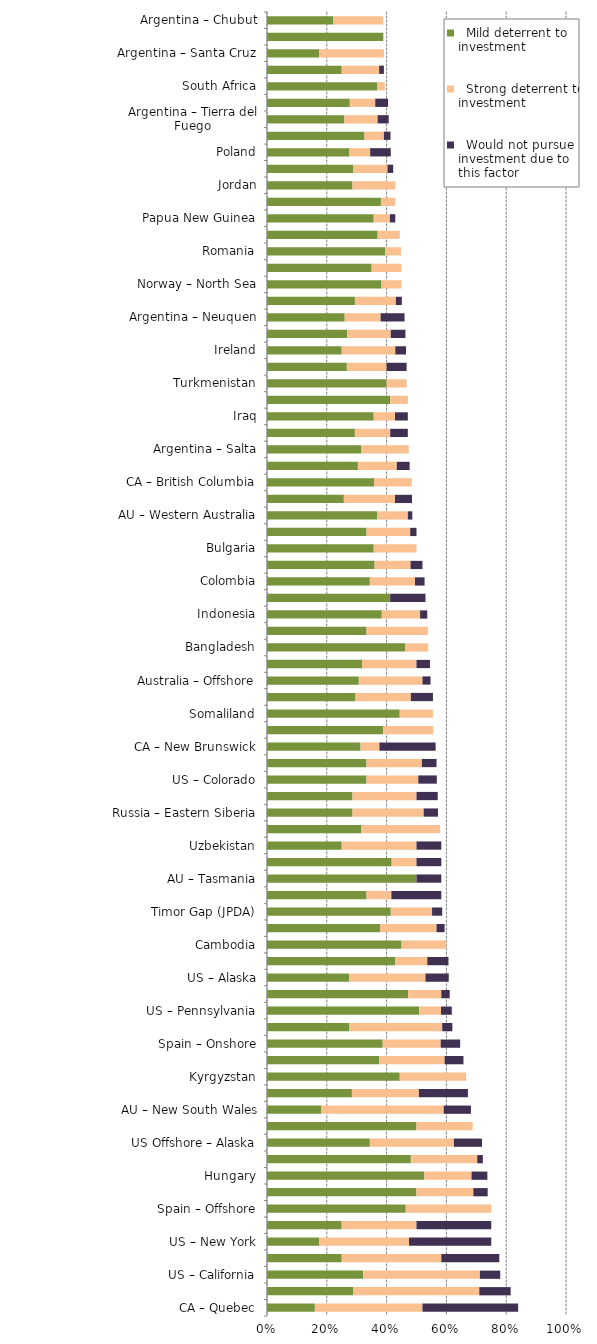
| Category |   Mild deterrent to investment |   Strong deterrent to investment |   Would not pursue investment due to this factor |
|---|---|---|---|
| CA – Quebec | 0.16 | 0.36 | 0.32 |
| Ecuador | 0.289 | 0.421 | 0.105 |
| US – California | 0.322 | 0.39 | 0.068 |
| France | 0.25 | 0.333 | 0.194 |
| US – New York | 0.175 | 0.3 | 0.275 |
| US Offshore – Pacific | 0.25 | 0.25 | 0.25 |
| Spain – Offshore | 0.464 | 0.286 | 0 |
| Brazil – Offshore presalt area profit sharing contracts | 0.5 | 0.19 | 0.048 |
| Hungary | 0.526 | 0.158 | 0.053 |
| Brazil – Offshore concession contracts | 0.481 | 0.222 | 0.019 |
| US Offshore – Alaska | 0.344 | 0.281 | 0.094 |
| Guatemala | 0.5 | 0.188 | 0 |
| AU – New South Wales | 0.182 | 0.409 | 0.091 |
| Venezuela | 0.284 | 0.224 | 0.164 |
| Kyrgyzstan | 0.444 | 0.222 | 0 |
| Peru | 0.375 | 0.219 | 0.063 |
| Spain – Onshore | 0.387 | 0.194 | 0.065 |
| Germany | 0.276 | 0.31 | 0.034 |
| US – Pennsylvania | 0.509 | 0.073 | 0.036 |
| Brazil – Onshore concession contracts | 0.472 | 0.111 | 0.028 |
| US – Alaska | 0.275 | 0.255 | 0.078 |
| Israel | 0.429 | 0.107 | 0.071 |
| Cambodia | 0.45 | 0.15 | 0 |
| AU – Queensland | 0.378 | 0.189 | 0.027 |
| Timor Gap (JPDA) | 0.414 | 0.138 | 0.034 |
| Iran | 0.333 | 0.083 | 0.167 |
| AU – Tasmania | 0.5 | 0 | 0.083 |
| Russia –  Offshore Arctic | 0.417 | 0.083 | 0.083 |
| Uzbekistan | 0.25 | 0.25 | 0.083 |
| Italy | 0.316 | 0.263 | 0 |
| Russia – Eastern Siberia | 0.286 | 0.238 | 0.048 |
| Bolivia | 0.286 | 0.214 | 0.071 |
| US – Colorado | 0.333 | 0.173 | 0.062 |
| US Offshore – Gulf of Mexico | 0.333 | 0.185 | 0.049 |
| CA – New Brunswick | 0.313 | 0.063 | 0.188 |
| Greenland | 0.389 | 0.167 | 0 |
| Somaliland | 0.444 | 0.111 | 0 |
| AU – Victoria | 0.296 | 0.185 | 0.074 |
| Australia – Offshore | 0.307 | 0.213 | 0.027 |
| Japan | 0.318 | 0.182 | 0.045 |
| Bangladesh | 0.462 | 0.077 | 0 |
| Nigeria | 0.333 | 0.205 | 0 |
| Indonesia | 0.384 | 0.128 | 0.024 |
| Greece | 0.412 | 0 | 0.118 |
| Colombia | 0.344 | 0.151 | 0.032 |
| Argentina – Mendoza | 0.36 | 0.12 | 0.04 |
| Bulgaria | 0.357 | 0.143 | 0 |
| Kazakhstan | 0.333 | 0.146 | 0.021 |
| AU – Western Australia | 0.368 | 0.103 | 0.015 |
| US – Michigan | 0.257 | 0.171 | 0.057 |
| CA – British Columbia | 0.358 | 0.126 | 0 |
| Ukraine | 0.304 | 0.13 | 0.043 |
| Argentina – Salta | 0.316 | 0.158 | 0 |
| Russia – Offshore Sakhalin | 0.294 | 0.118 | 0.059 |
| Iraq | 0.357 | 0.071 | 0.043 |
| Guyana | 0.412 | 0.059 | 0 |
| Turkmenistan | 0.4 | 0.067 | 0 |
| French Guiana | 0.267 | 0.133 | 0.067 |
| Ireland | 0.25 | 0.179 | 0.036 |
| Russia – other | 0.268 | 0.146 | 0.049 |
| Argentina – Neuquen | 0.26 | 0.12 | 0.08 |
| India | 0.294 | 0.137 | 0.02 |
| Norway – North Sea | 0.383 | 0.067 | 0 |
| Chile | 0.35 | 0.1 | 0 |
| Romania | 0.395 | 0.053 | 0 |
| Kuwait | 0.37 | 0.074 | 0 |
| Papua New Guinea | 0.357 | 0.054 | 0.018 |
| Chad | 0.381 | 0.048 | 0 |
| Jordan | 0.286 | 0.143 | 0 |
| New Zealand | 0.288 | 0.115 | 0.019 |
| Poland | 0.276 | 0.069 | 0.069 |
| US – Ohio | 0.326 | 0.065 | 0.022 |
| Argentina – Tierra del Fuego | 0.259 | 0.111 | 0.037 |
| US – Utah | 0.277 | 0.085 | 0.043 |
| South Africa | 0.368 | 0.026 | 0 |
| US – New Mexico | 0.25 | 0.125 | 0.016 |
| Argentina – Santa Cruz | 0.174 | 0.217 | 0 |
| Democratic Republic of the Congo (Kinshasa) | 0.389 | 0 | 0 |
| Argentina – Chubut | 0.222 | 0.167 | 0 |